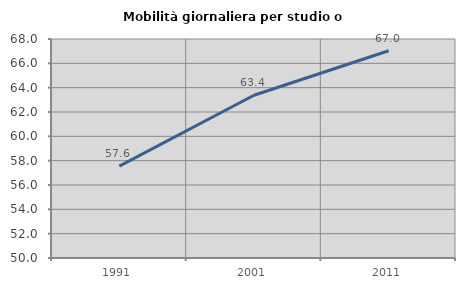
| Category | Mobilità giornaliera per studio o lavoro |
|---|---|
| 1991.0 | 57.556 |
| 2001.0 | 63.376 |
| 2011.0 | 67.038 |